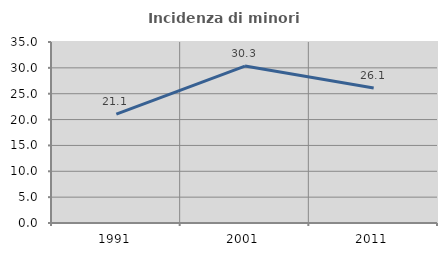
| Category | Incidenza di minori stranieri |
|---|---|
| 1991.0 | 21.053 |
| 2001.0 | 30.348 |
| 2011.0 | 26.112 |